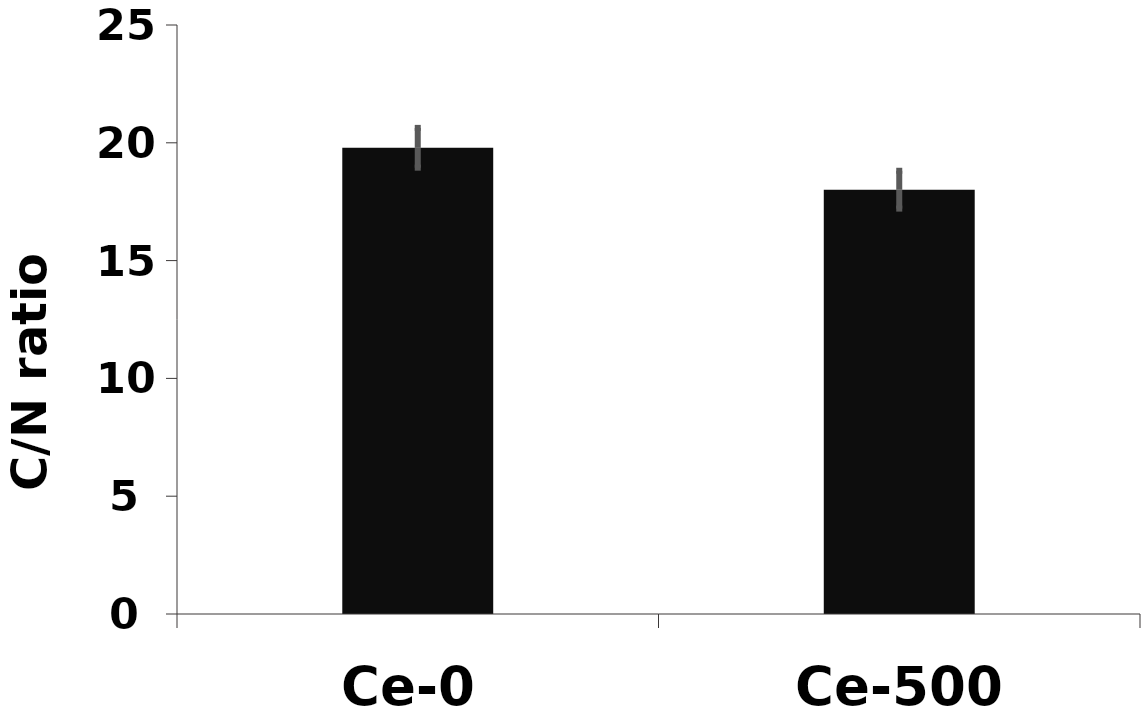
| Category | C/N |
|---|---|
| Ce-0 | 19.788 |
| Ce-500 | 18.01 |